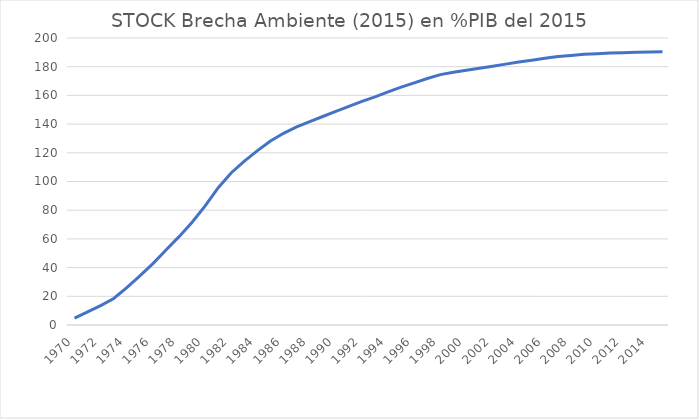
| Category | STOCK Brecha Ambiente (2015) en %PIB del 2015 |
|---|---|
| 1970.0 | 4.859 |
| 1971.0 | 9.103 |
| 1972.0 | 13.56 |
| 1973.0 | 18.5 |
| 1974.0 | 26.102 |
| 1975.0 | 34.181 |
| 1976.0 | 42.799 |
| 1977.0 | 52.277 |
| 1978.0 | 61.568 |
| 1979.0 | 71.58 |
| 1980.0 | 83.023 |
| 1981.0 | 95.664 |
| 1982.0 | 106.123 |
| 1983.0 | 114.269 |
| 1984.0 | 121.534 |
| 1985.0 | 128.195 |
| 1986.0 | 133.569 |
| 1987.0 | 137.989 |
| 1988.0 | 141.721 |
| 1989.0 | 145.301 |
| 1990.0 | 148.84 |
| 1991.0 | 152.39 |
| 1992.0 | 155.788 |
| 1993.0 | 158.981 |
| 1994.0 | 162.413 |
| 1995.0 | 165.717 |
| 1996.0 | 168.764 |
| 1997.0 | 171.796 |
| 1998.0 | 174.475 |
| 1999.0 | 176.142 |
| 2000.0 | 177.517 |
| 2001.0 | 178.868 |
| 2002.0 | 180.302 |
| 2003.0 | 181.792 |
| 2004.0 | 183.28 |
| 2005.0 | 184.497 |
| 2006.0 | 185.862 |
| 2007.0 | 187.093 |
| 2008.0 | 187.746 |
| 2009.0 | 188.592 |
| 2010.0 | 189.087 |
| 2011.0 | 189.506 |
| 2012.0 | 189.773 |
| 2013.0 | 190.049 |
| 2014.0 | 190.186 |
| 2015.0 | 190.339 |